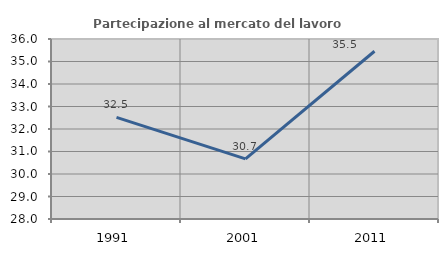
| Category | Partecipazione al mercato del lavoro  femminile |
|---|---|
| 1991.0 | 32.516 |
| 2001.0 | 30.671 |
| 2011.0 | 35.455 |